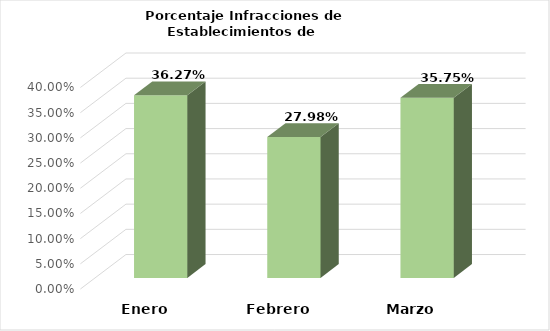
| Category | Series 0 |
|---|---|
| Enero | 0.363 |
| Febrero | 0.28 |
| Marzo | 0.358 |